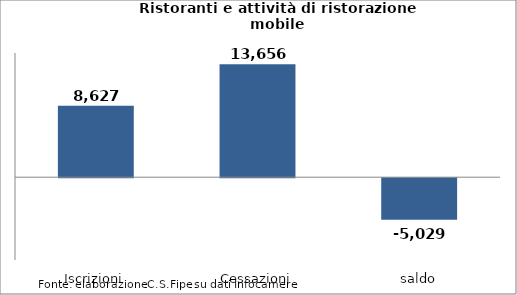
| Category | Series 0 |
|---|---|
| Iscrizioni | 8627 |
| Cessazioni | 13656 |
| saldo | -5029 |